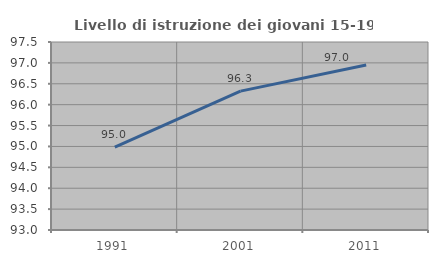
| Category | Livello di istruzione dei giovani 15-19 anni |
|---|---|
| 1991.0 | 94.982 |
| 2001.0 | 96.324 |
| 2011.0 | 96.951 |